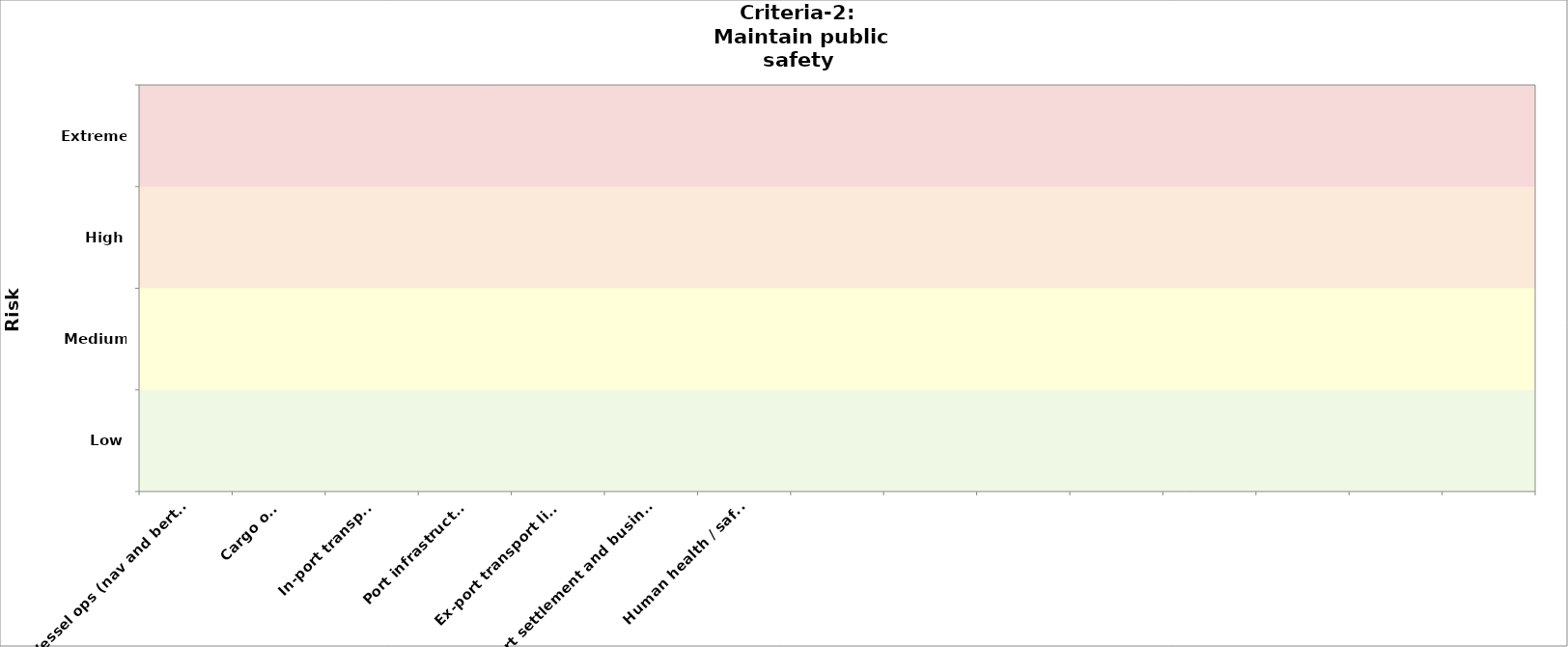
| Category | Criteria-3 (public health) | Criteria-2 2030 |
|---|---|---|
| Vessel ops (nav and berthing) |  | 0 |
| Cargo ops |  | 0 |
| In-port transport |  | 0 |
| Port infrastructure |  | 0 |
| Ex-port transport links |  | 0 |
| Ex-port settlement and businesses |  | 0 |
| Human health / safety  |  | 0 |